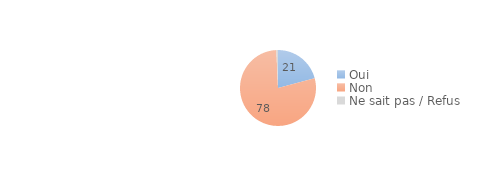
| Category | Series 0 |
|---|---|
| Oui | 20.85 |
| Non | 78.45 |
| Ne sait pas / Refus | 0.7 |